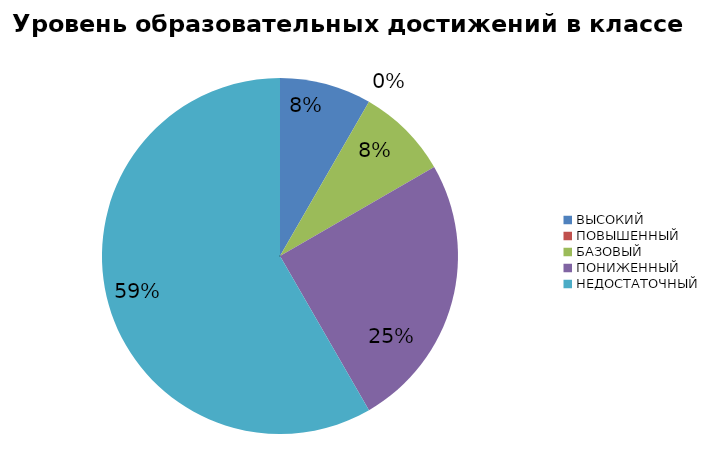
| Category | Series 0 |
|---|---|
| ВЫСОКИЙ | 8.333 |
| ПОВЫШЕННЫЙ | 0 |
| БАЗОВЫЙ | 8.333 |
| ПОНИЖЕННЫЙ | 25 |
| НЕДОСТАТОЧНЫЙ | 58.333 |